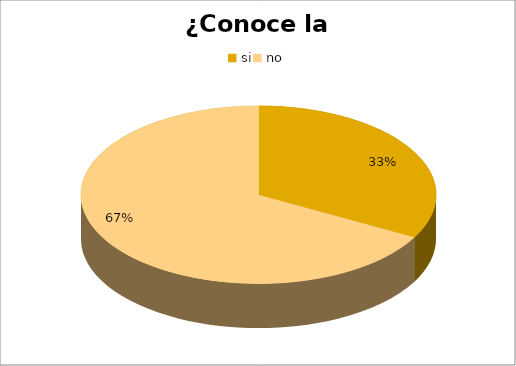
| Category | Series 0 |
|---|---|
| si | 31 |
| no | 63 |